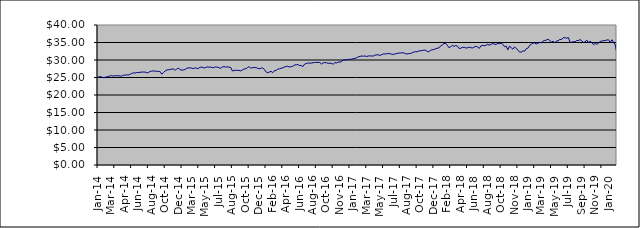
| Category | Series 0 |
|---|---|
| 2014-01-09 | 25.135 |
| 2014-01-17 | 25.208 |
| 2014-01-23 | 25.226 |
| 2014-01-31 | 24.94 |
| 2014-02-10 | 24.988 |
| 2014-02-14 | 25.199 |
| 2014-02-20 | 25.213 |
| 2014-02-28 | 25.404 |
| 2014-03-10 | 25.599 |
| 2014-03-14 | 25.391 |
| 2014-03-20 | 25.494 |
| 2014-03-26 | 25.538 |
| 2014-03-31 | 25.489 |
| 2014-04-09 | 25.47 |
| 2014-04-15 | 25.335 |
| 2014-04-24 | 25.662 |
| 2014-04-30 | 25.688 |
| 2014-05-08 | 25.733 |
| 2014-05-16 | 25.712 |
| 2014-05-22 | 25.855 |
| 2014-05-31 | 26.152 |
| 2014-06-09 | 26.333 |
| 2014-06-16 | 26.256 |
| 2014-06-20 | 26.409 |
| 2014-06-30 | 26.433 |
| 2014-07-09 | 26.464 |
| 2014-07-15 | 26.56 |
| 2014-07-22 | 26.553 |
| 2014-07-31 | 26.563 |
| 2014-08-11 | 26.332 |
| 2014-08-14 | 26.425 |
| 2014-08-21 | 26.716 |
| 2014-08-30 | 26.816 |
| 2014-09-08 | 26.901 |
| 2014-09-16 | 26.761 |
| 2014-09-23 | 26.819 |
| 2014-09-30 | 26.714 |
| 2014-10-09 | 26.671 |
| 2014-10-16 | 25.964 |
| 2014-10-23 | 26.402 |
| 2014-10-31 | 26.881 |
| 2014-11-10 | 27.163 |
| 2014-11-13 | 27.222 |
| 2014-11-20 | 27.283 |
| 2014-11-29 | 27.433 |
| 2014-12-10 | 27.426 |
| 2014-12-18 | 27.04 |
| 2014-12-23 | 27.528 |
| 2014-12-30 | 27.624 |
| 2015-01-08 | 27.202 |
| 2015-01-15 | 27.121 |
| 2015-01-30 | 27.163 |
| 2015-02-10 | 27.348 |
| 2015-02-16 | 27.702 |
| 2015-02-19 | 27.73 |
| 2015-02-28 | 27.78 |
| 2015-03-10 | 27.633 |
| 2015-03-13 | 27.558 |
| 2015-03-19 | 27.792 |
| 2015-03-27 | 27.521 |
| 2015-04-07 | 27.697 |
| 2015-04-16 | 27.922 |
| 2015-04-27 | 27.96 |
| 2015-05-08 | 27.711 |
| 2015-05-14 | 27.833 |
| 2015-05-21 | 28.057 |
| 2015-05-27 | 27.932 |
| 2015-06-03 | 27.999 |
| 2015-06-09 | 27.781 |
| 2015-06-15 | 27.89 |
| 2015-06-22 | 28.003 |
| 2015-06-26 | 27.961 |
| 2015-07-02 | 27.809 |
| 2015-07-09 | 27.621 |
| 2015-07-14 | 27.999 |
| 2015-07-23 | 28.11 |
| 2015-07-29 | 27.971 |
| 2015-08-06 | 28.03 |
| 2015-08-13 | 27.948 |
| 2015-08-20 | 27.897 |
| 2015-08-27 | 26.892 |
| 2015-09-03 | 26.962 |
| 2015-09-09 | 27.104 |
| 2015-09-15 | 27.014 |
| 2015-09-21 | 27.051 |
| 2015-09-28 | 26.866 |
| 2015-10-07 | 27.166 |
| 2015-10-13 | 27.441 |
| 2015-10-22 | 27.497 |
| 2015-10-28 | 27.834 |
| 2015-11-04 | 28.119 |
| 2015-11-13 | 27.618 |
| 2015-11-19 | 27.836 |
| 2015-11-27 | 27.849 |
| 2015-12-03 | 27.85 |
| 2015-12-10 | 27.656 |
| 2015-12-15 | 27.487 |
| 2015-12-23 | 27.631 |
| 2015-12-29 | 27.765 |
| 2016-01-07 | 27.327 |
| 2016-01-14 | 26.601 |
| 2016-01-21 | 26.342 |
| 2016-01-28 | 26.558 |
| 2016-02-04 | 26.763 |
| 2016-02-11 | 26.366 |
| 2016-02-18 | 26.953 |
| 2016-02-25 | 26.989 |
| 2016-03-03 | 27.418 |
| 2016-03-10 | 27.444 |
| 2016-03-16 | 27.655 |
| 2016-03-29 | 27.753 |
| 2016-04-07 | 27.987 |
| 2016-04-14 | 28.133 |
| 2016-04-28 | 28.231 |
| 2016-05-05 | 27.969 |
| 2016-05-12 | 28.098 |
| 2016-05-19 | 28.219 |
| 2016-05-30 | 28.574 |
| 2016-06-03 | 28.621 |
| 2016-06-09 | 28.716 |
| 2016-06-15 | 28.418 |
| 2016-06-23 | 28.432 |
| 2016-06-29 | 28.104 |
| 2016-07-11 | 28.829 |
| 2016-07-14 | 28.997 |
| 2016-07-21 | 29.153 |
| 2016-07-28 | 29.111 |
| 2016-08-04 | 29.108 |
| 2016-08-11 | 29.224 |
| 2016-08-16 | 29.287 |
| 2016-08-24 | 29.318 |
| 2016-08-30 | 29.288 |
| 2016-09-08 | 29.314 |
| 2016-09-15 | 28.841 |
| 2016-09-22 | 29.159 |
| 2016-09-29 | 29.285 |
| 2016-10-06 | 29.207 |
| 2016-10-13 | 29.046 |
| 2016-10-20 | 29.087 |
| 2016-10-28 | 29.011 |
| 2016-11-03 | 28.799 |
| 2016-11-10 | 29.252 |
| 2016-11-15 | 29.156 |
| 2016-11-23 | 29.407 |
| 2016-11-29 | 29.404 |
| 2016-12-07 | 29.509 |
| 2016-12-14 | 30.032 |
| 2016-12-21 | 30.022 |
| 2016-12-28 | 30.045 |
| 2017-01-05 | 30.115 |
| 2017-01-16 | 30.238 |
| 2017-01-23 | 30.226 |
| 2017-01-30 | 30.402 |
| 2017-02-06 | 30.464 |
| 2017-02-13 | 30.641 |
| 2017-02-20 | 30.896 |
| 2017-02-27 | 31.045 |
| 2017-03-06 | 31.141 |
| 2017-03-13 | 31.071 |
| 2017-03-20 | 31.171 |
| 2017-03-27 | 30.993 |
| 2017-03-30 | 31.153 |
| 2017-04-10 | 31.17 |
| 2017-04-18 | 31.138 |
| 2017-04-24 | 31.133 |
| 2017-04-28 | 31.404 |
| 2017-05-08 | 31.484 |
| 2017-05-15 | 31.442 |
| 2017-05-22 | 31.302 |
| 2017-05-30 | 31.569 |
| 2017-06-06 | 31.743 |
| 2017-06-12 | 31.72 |
| 2017-06-15 | 31.764 |
| 2017-06-20 | 31.886 |
| 2017-06-29 | 31.765 |
| 2017-07-04 | 31.662 |
| 2017-07-10 | 31.576 |
| 2017-07-14 | 31.764 |
| 2017-07-19 | 31.878 |
| 2017-07-24 | 31.966 |
| 2017-07-28 | 32.009 |
| 2017-08-03 | 32.047 |
| 2017-08-09 | 32.038 |
| 2017-08-14 | 31.804 |
| 2017-08-21 | 31.717 |
| 2017-08-24 | 31.847 |
| 2017-08-30 | 31.848 |
| 2017-09-07 | 32.034 |
| 2017-09-14 | 32.282 |
| 2017-09-20 | 32.357 |
| 2017-09-29 | 32.341 |
| 2017-10-05 | 32.566 |
| 2017-10-11 | 32.652 |
| 2017-10-16 | 32.685 |
| 2017-10-23 | 32.815 |
| 2017-10-30 | 32.776 |
| 2017-11-07 | 32.444 |
| 2017-11-15 | 32.365 |
| 2017-11-23 | 32.777 |
| 2017-11-29 | 32.921 |
| 2017-12-07 | 33.004 |
| 2017-12-13 | 33.215 |
| 2017-12-18 | 33.358 |
| 2017-12-28 | 33.469 |
| 2018-01-08 | 34.027 |
| 2018-01-17 | 34.292 |
| 2018-01-24 | 34.689 |
| 2018-01-30 | 34.772 |
| 2018-02-05 | 34.204 |
| 2018-02-13 | 33.483 |
| 2018-02-19 | 33.837 |
| 2018-02-27 | 34.167 |
| 2018-03-07 | 33.873 |
| 2018-03-14 | 34.17 |
| 2018-03-21 | 33.955 |
| 2018-03-29 | 33.264 |
| 2018-04-10 | 33.394 |
| 2018-04-16 | 33.596 |
| 2018-04-23 | 33.611 |
| 2018-04-27 | 33.42 |
| 2018-05-10 | 33.495 |
| 2018-05-15 | 33.68 |
| 2018-05-22 | 33.514 |
| 2018-05-30 | 33.436 |
| 2018-06-06 | 33.7 |
| 2018-06-13 | 33.928 |
| 2018-06-20 | 33.712 |
| 2018-06-29 | 33.319 |
| 2018-07-10 | 34.042 |
| 2018-07-16 | 34.178 |
| 2018-07-23 | 34.077 |
| 2018-07-30 | 34.219 |
| 2018-08-07 | 34.479 |
| 2018-08-13 | 34.248 |
| 2018-08-24 | 34.472 |
| 2018-08-30 | 34.72 |
| 2018-09-06 | 34.528 |
| 2018-09-13 | 34.432 |
| 2018-09-24 | 34.752 |
| 2018-09-28 | 34.645 |
| 2018-10-04 | 34.819 |
| 2018-10-10 | 34.504 |
| 2018-10-16 | 33.81 |
| 2018-10-23 | 33.975 |
| 2018-10-30 | 32.915 |
| 2018-11-07 | 33.935 |
| 2018-11-15 | 33.528 |
| 2018-11-21 | 33.097 |
| 2018-11-29 | 33.728 |
| 2018-12-07 | 33.335 |
| 2018-12-14 | 32.831 |
| 2018-12-21 | 32.251 |
| 2018-12-28 | 32.276 |
| 2019-01-08 | 32.591 |
| 2019-01-14 | 32.542 |
| 2019-01-21 | 33.232 |
| 2019-01-30 | 33.4 |
| 2019-02-11 | 34.196 |
| 2019-02-14 | 34.552 |
| 2019-02-21 | 34.837 |
| 2019-02-27 | 34.877 |
| 2019-03-07 | 34.585 |
| 2019-03-14 | 34.816 |
| 2019-03-21 | 35.039 |
| 2019-03-29 | 34.872 |
| 2019-04-04 | 35.403 |
| 2019-04-12 | 35.582 |
| 2019-04-18 | 35.697 |
| 2019-04-29 | 35.924 |
| 2019-05-08 | 35.546 |
| 2019-05-15 | 35.152 |
| 2019-05-23 | 35.354 |
| 2019-05-30 | 34.897 |
| 2019-06-10 | 35.466 |
| 2019-06-14 | 35.441 |
| 2019-06-21 | 35.952 |
| 2019-06-28 | 35.807 |
| 2019-07-04 | 36.387 |
| 2019-07-15 | 36.374 |
| 2019-07-22 | 36.204 |
| 2019-07-30 | 36.438 |
| 2019-08-06 | 35.128 |
| 2019-08-16 | 35.05 |
| 2019-08-22 | 35.274 |
| 2019-08-30 | 35.131 |
| 2019-09-09 | 35.592 |
| 2019-09-16 | 35.549 |
| 2019-09-20 | 35.832 |
| 2019-09-27 | 35.505 |
| 2019-10-03 | 34.999 |
| 2019-10-09 | 35.14 |
| 2019-10-15 | 35.695 |
| 2019-10-30 | 35.008 |
| 2019-11-07 | 35.334 |
| 2019-11-14 | 34.988 |
| 2019-11-21 | 34.361 |
| 2019-11-29 | 34.751 |
| 2019-12-05 | 34.484 |
| 2019-12-11 | 34.851 |
| 2019-12-17 | 35.3 |
| 2019-12-23 | 35.404 |
| 2019-12-30 | 35.526 |
| 2020-01-07 | 35.553 |
| 2020-01-15 | 35.723 |
| 2020-01-22 | 35.771 |
| 2020-01-30 | 35.022 |
| 2020-02-06 | 35.779 |
| 2020-02-14 | 35.033 |
| 2020-02-20 | 34.267 |
| 2020-02-28 | 31.674 |